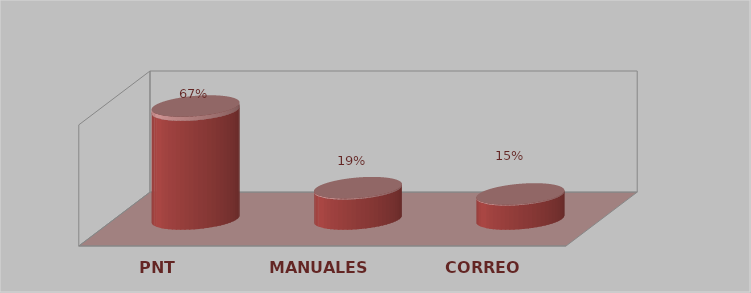
| Category | Series 0 | Series 1 |
|---|---|---|
| PNT | 18 | 0.667 |
| MANUALES | 5 | 0.185 |
| CORREO | 4 | 0.148 |